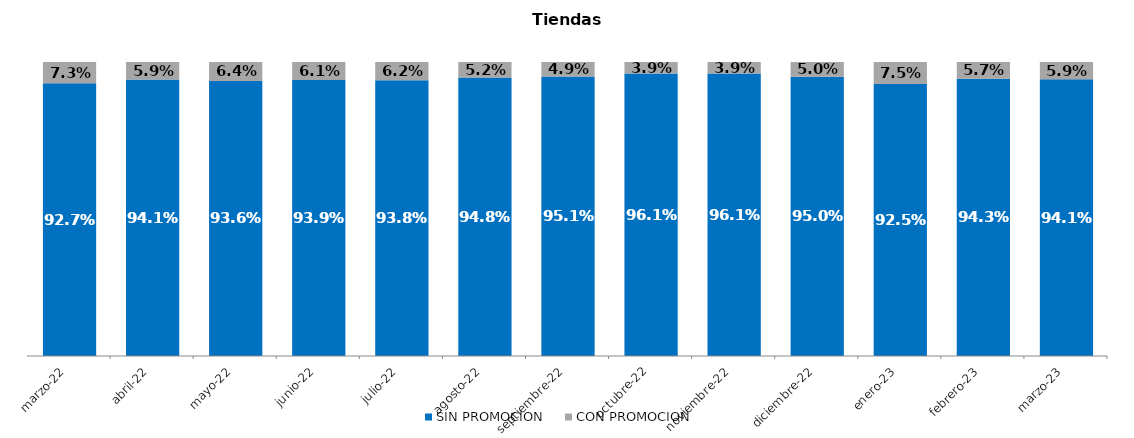
| Category | SIN PROMOCION   | CON PROMOCION   |
|---|---|---|
| 2022-03-01 | 0.927 | 0.073 |
| 2022-04-01 | 0.941 | 0.059 |
| 2022-05-01 | 0.936 | 0.064 |
| 2022-06-01 | 0.939 | 0.061 |
| 2022-07-01 | 0.938 | 0.062 |
| 2022-08-01 | 0.948 | 0.052 |
| 2022-09-01 | 0.951 | 0.049 |
| 2022-10-01 | 0.961 | 0.039 |
| 2022-11-01 | 0.961 | 0.039 |
| 2022-12-01 | 0.95 | 0.05 |
| 2023-01-01 | 0.925 | 0.075 |
| 2023-02-01 | 0.943 | 0.057 |
| 2023-03-01 | 0.941 | 0.059 |